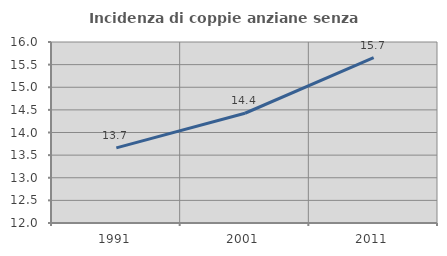
| Category | Incidenza di coppie anziane senza figli  |
|---|---|
| 1991.0 | 13.66 |
| 2001.0 | 14.425 |
| 2011.0 | 15.652 |